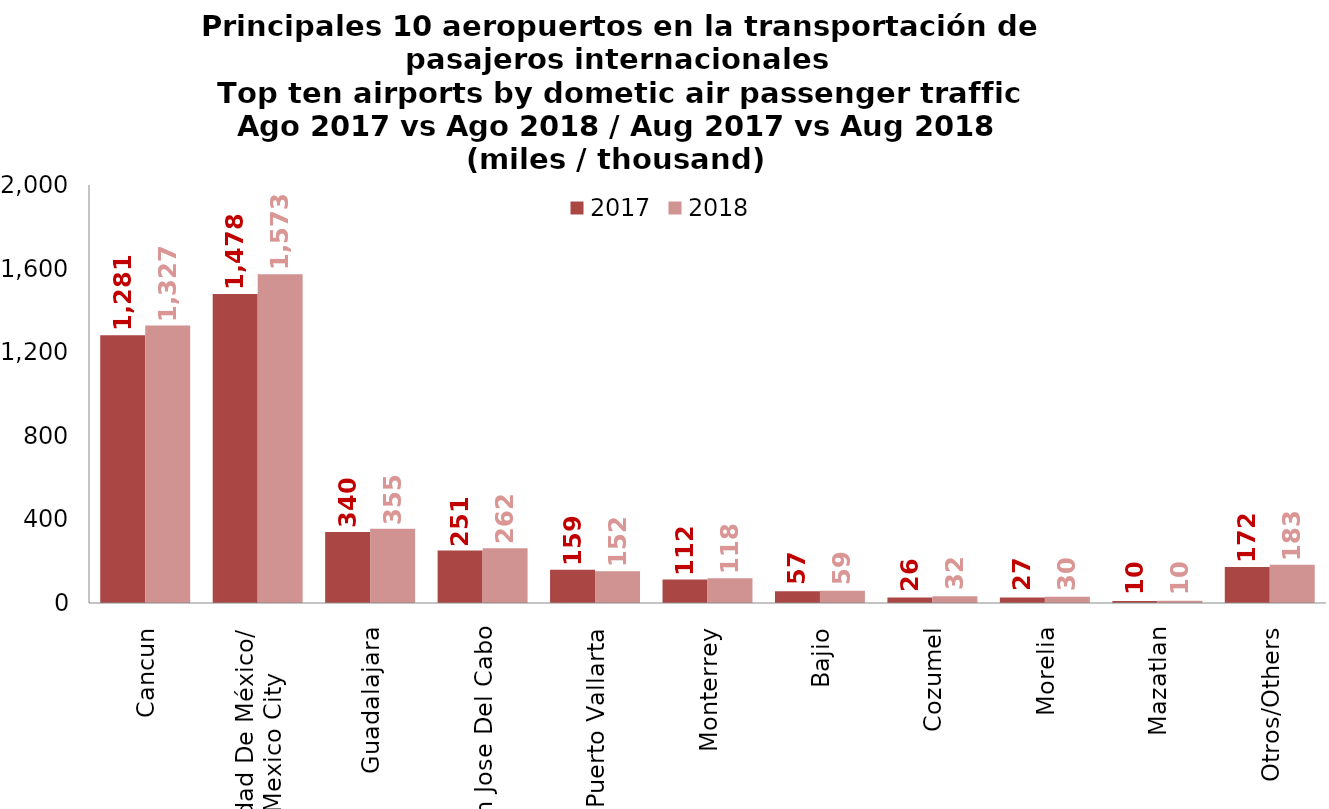
| Category | 2017 | 2018 |
|---|---|---|
| Cancun | 1281.316 | 1327.412 |
| Ciudad De México/
Mexico City | 1478.042 | 1573.323 |
| Guadalajara | 339.556 | 355.131 |
| San Jose Del Cabo | 250.63 | 261.933 |
| Puerto Vallarta | 159.278 | 152.342 |
| Monterrey | 111.856 | 118.25 |
| Bajio | 56.737 | 58.785 |
| Cozumel | 25.786 | 31.869 |
| Morelia | 26.52 | 30.033 |
| Mazatlan | 10.1 | 10.209 |
| Otros/Others | 171.982 | 182.608 |